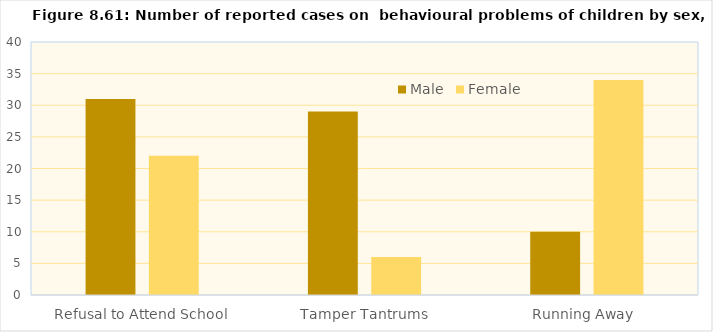
| Category | Male | Female |
|---|---|---|
| Refusal to Attend School | 31 | 22 |
| Tamper Tantrums | 29 | 6 |
| Running Away  | 10 | 34 |